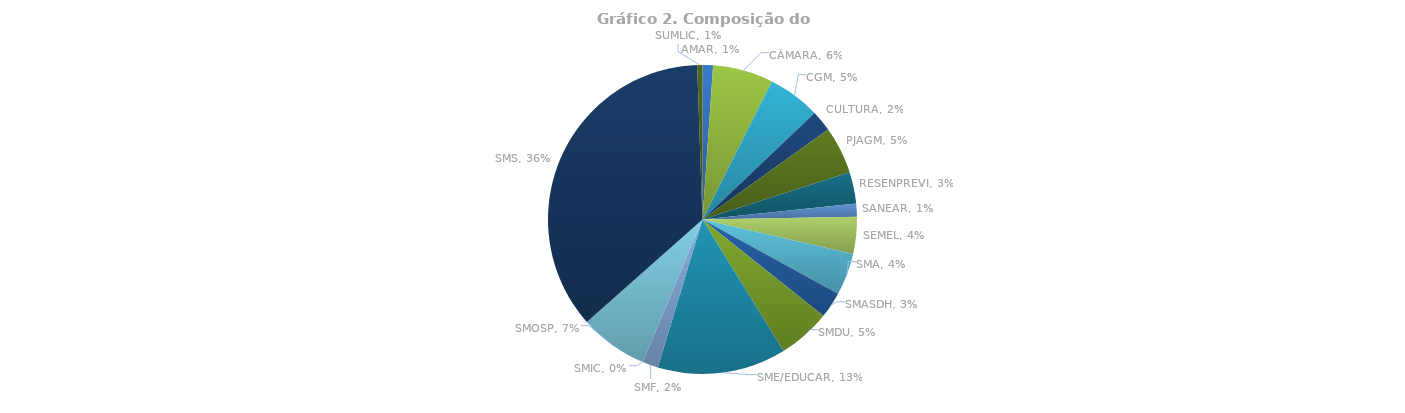
| Category | Total |
|---|---|
| AMAR | 0.011 |
| CÂMARA | 0.063 |
| CGM | 0.055 |
| CULTURA | 0.022 |
| PJAGM | 0.049 |
| RESENPREVI | 0.033 |
| SANEAR | 0.014 |
| SEMEL | 0.038 |
| SMA | 0.044 |
| SMASDH | 0.027 |
| SMDU | 0.055 |
| SME/EDUCAR | 0.135 |
| SMF | 0.016 |
| SMIC | 0 |
| SMOSP | 0.071 |
| SMS | 0.36 |
| SUMLIC | 0.005 |